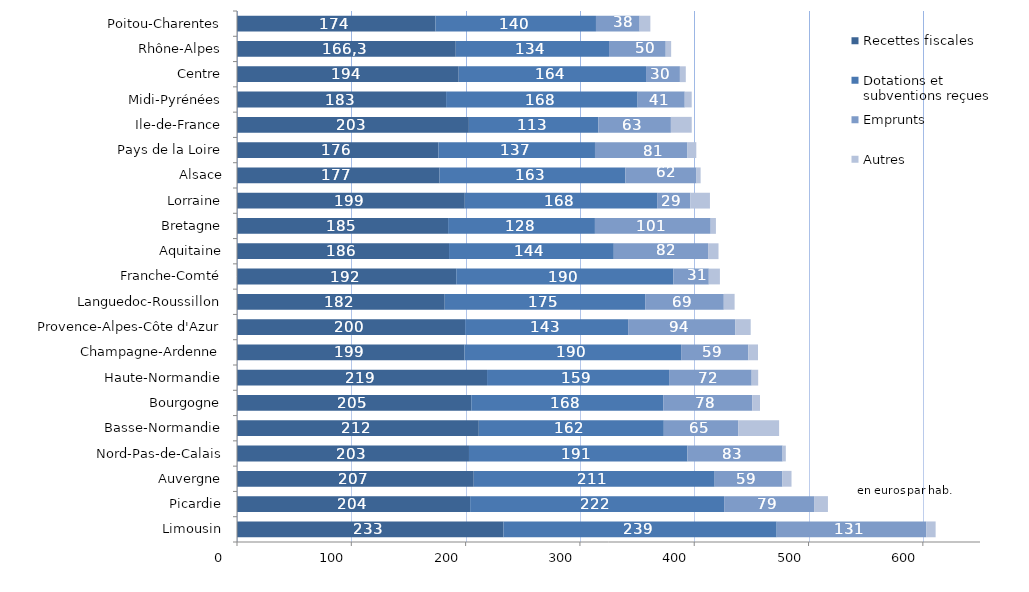
| Category | Recettes fiscales | Dotations et subventions reçues | Emprunts | Autres |
|---|---|---|---|---|
| Limousin | 233.104 | 239.025 | 130.774 | 8.275 |
| Picardie | 203.969 | 222.196 | 78.678 | 12.134 |
| Auvergne | 207.109 | 210.78 | 59.267 | 7.95 |
| Nord-Pas-de-Calais | 202.943 | 191.112 | 83.219 | 2.85 |
| Basse-Normandie | 211.535 | 161.852 | 65.255 | 35.614 |
| Bourgogne | 204.956 | 167.915 | 77.809 | 6.853 |
| Haute-Normandie | 218.753 | 159.231 | 72.27 | 5.686 |
| Champagne-Ardenne | 199.011 | 189.526 | 58.744 | 8.525 |
| Provence-Alpes-Côte d'Azur | 199.572 | 142.602 | 93.872 | 13.358 |
| Languedoc-Roussillon | 181.725 | 175.365 | 68.767 | 9.475 |
| Franche-Comté | 191.801 | 189.856 | 31.09 | 9.718 |
| Aquitaine | 185.51 | 144.123 | 82.487 | 9.119 |
| Bretagne | 184.676 | 128.452 | 101.26 | 4.592 |
| Lorraine | 199.285 | 168.267 | 29.086 | 17.107 |
| Alsace | 177.214 | 162.544 | 62.243 | 3.579 |
| Pays de la Loire | 176.231 | 136.945 | 80.917 | 7.72 |
| Ile-de-France | 202.855 | 113.271 | 63.46 | 18.237 |
| Midi-Pyrénées | 182.925 | 167.55 | 41.228 | 6.095 |
| Centre | 193.945 | 163.889 | 29.637 | 5.15 |
| Rhône-Alpes | 191.371 | 134.084 | 49.604 | 4.751 |
| Poitou-Charentes | 173.653 | 140.386 | 38.203 | 9.376 |